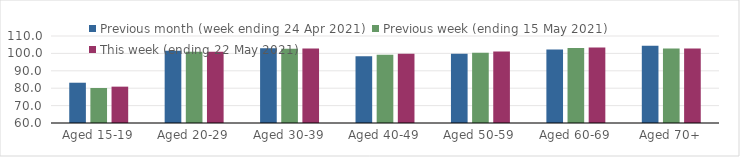
| Category | Previous month (week ending 24 Apr 2021) | Previous week (ending 15 May 2021) | This week (ending 22 May 2021) |
|---|---|---|---|
| Aged 15-19 | 83.15 | 80.12 | 80.89 |
| Aged 20-29 | 101.54 | 100.91 | 101.01 |
| Aged 30-39 | 103 | 102.73 | 102.87 |
| Aged 40-49 | 98.41 | 99.16 | 99.73 |
| Aged 50-59 | 99.77 | 100.36 | 101.05 |
| Aged 60-69 | 102.27 | 103.15 | 103.44 |
| Aged 70+ | 104.43 | 102.85 | 102.86 |